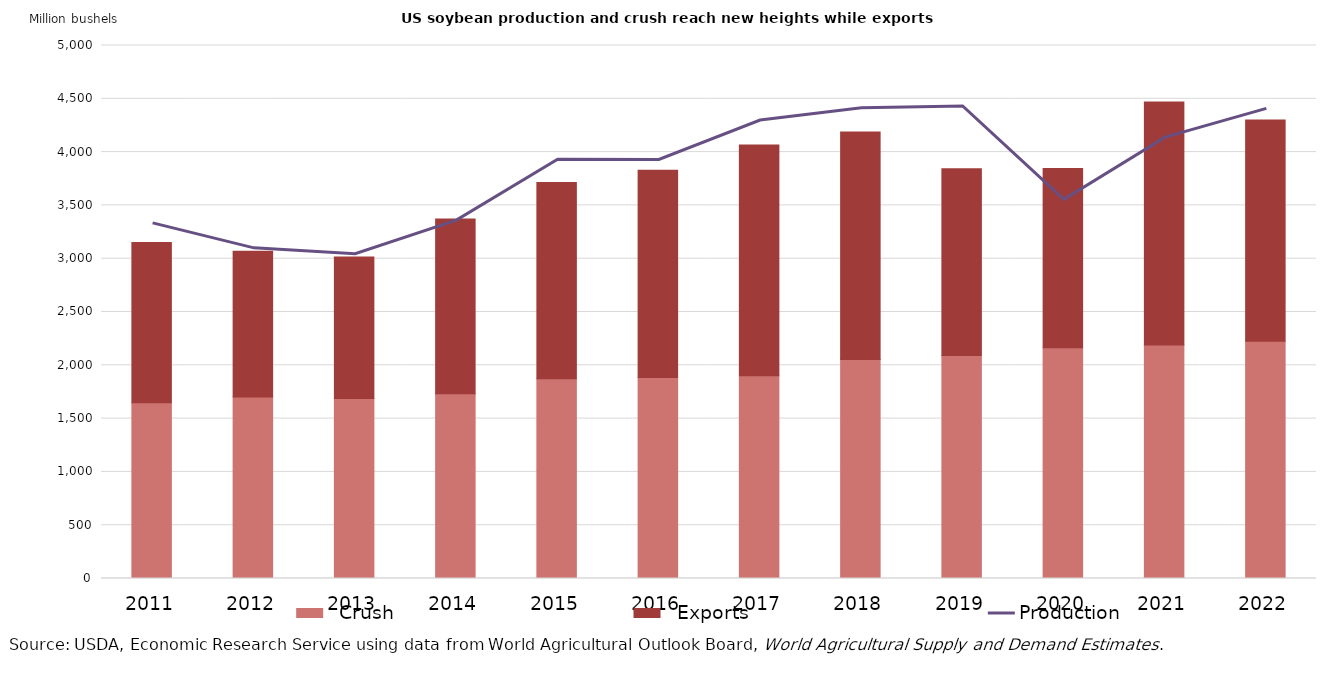
| Category |   Crush |   Exports |
|---|---|---|
| 2011.0 | 1648 | 1504.978 |
| 2012.0 | 1703 | 1366.335 |
| 2013.0 | 1689 | 1327.526 |
| 2014.0 | 1734 | 1638.559 |
| 2015.0 | 1873 | 1842.175 |
| 2016.0 | 1886.237 | 1942.606 |
| 2017.0 | 1901.198 | 2166.551 |
| 2018.0 | 2054.932 | 2133.731 |
| 2019.0 | 2091.99 | 1751.81 |
| 2020.0 | 2164.554 | 1682.023 |
| 2021.0 | 2190 | 2280 |
| 2022.0 | 2225 | 2075 |